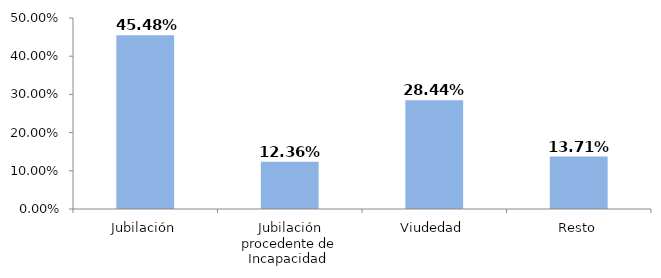
| Category | Series 0 |
|---|---|
| Jubilación | 0.455 |
| Jubilación procedente de Incapacidad  | 0.124 |
| Viudedad | 0.284 |
| Resto | 0.137 |